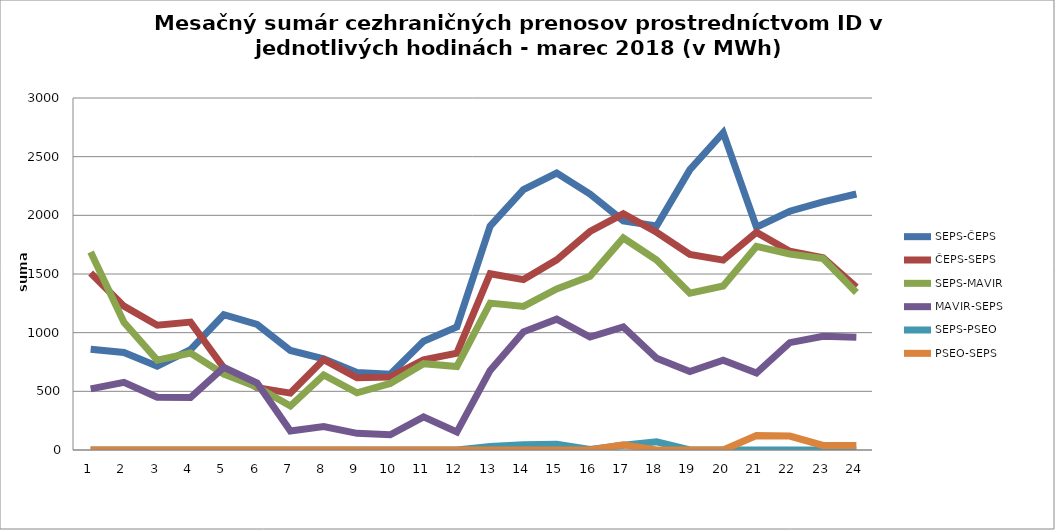
| Category | SEPS-ČEPS | ČEPS-SEPS | SEPS-MAVIR | MAVIR-SEPS | SEPS-PSEO | PSEO-SEPS |
|---|---|---|---|---|---|---|
| 1.0 | 858 | 1509 | 1687 | 521 | 0 | 0 |
| 2.0 | 831 | 1226 | 1088 | 576 | 0 | 0 |
| 3.0 | 714 | 1063 | 766 | 450 | 0 | 0 |
| 4.0 | 855 | 1090 | 827 | 447 | 0 | 0 |
| 5.0 | 1153 | 701 | 647 | 704 | 0 | 0 |
| 6.0 | 1070 | 531 | 538 | 571 | 0 | 0 |
| 7.0 | 848 | 485 | 375 | 162 | 0 | 0 |
| 8.0 | 776 | 770 | 639 | 199 | 0 | 0 |
| 9.0 | 660 | 616 | 487 | 142 | 0 | 0 |
| 10.0 | 646 | 621 | 567 | 130 | 0 | 0 |
| 11.0 | 927 | 768 | 736 | 282 | 0 | 0 |
| 12.0 | 1049 | 825 | 712 | 153 | 0 | 0 |
| 13.0 | 1908 | 1502 | 1252 | 678 | 29 | 0 |
| 14.0 | 2219 | 1452 | 1224 | 1007 | 44 | 0 |
| 15.0 | 2360 | 1621 | 1373 | 1115 | 50 | 0 |
| 16.0 | 2181 | 1862 | 1480 | 963 | 5 | 0 |
| 17.0 | 1953 | 2013 | 1807 | 1049 | 40 | 45 |
| 18.0 | 1909 | 1856 | 1619 | 781 | 70 | 0 |
| 19.0 | 2389 | 1666 | 1337 | 669 | 0 | 0 |
| 20.0 | 2705 | 1618 | 1398 | 765 | 0 | 0 |
| 21.0 | 1899 | 1855 | 1735 | 656 | 0 | 123 |
| 22.0 | 2035 | 1694 | 1671 | 915 | 0 | 119 |
| 23.0 | 2114 | 1638 | 1631 | 969 | 0 | 39 |
| 24.0 | 2182 | 1388 | 1343 | 961 | 0 | 38 |